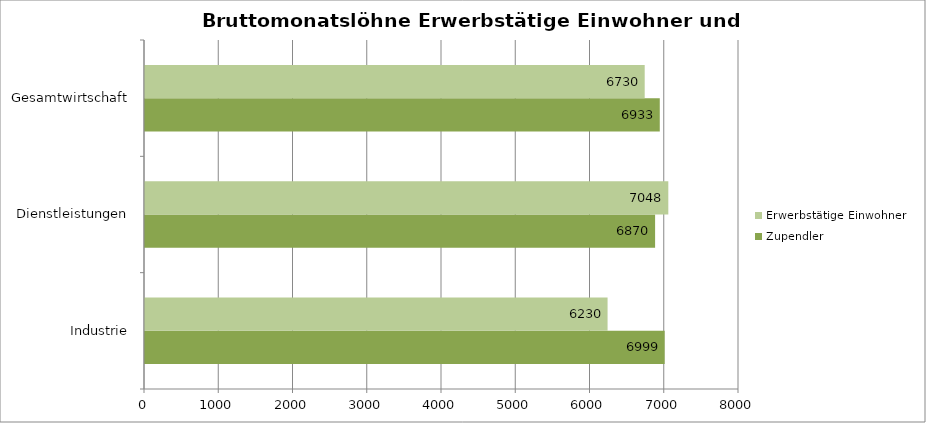
| Category | Zupendler | Erwerbstätige Einwohner |
|---|---|---|
| Industrie | 6999 | 6230 |
| Dienstleistungen | 6870 | 7048 |
| Gesamtwirtschaft | 6933 | 6730 |